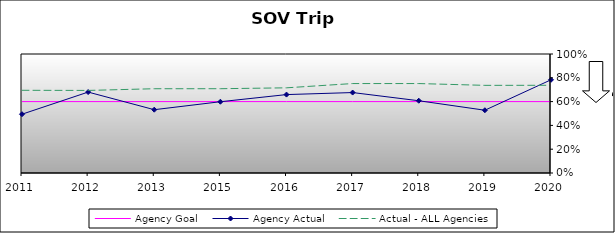
| Category | Agency Goal | Agency Actual | Actual - ALL Agencies |
|---|---|---|---|
| 2011.0 | 0.6 | 0.494 | 0.695 |
| 2012.0 | 0.6 | 0.68 | 0.694 |
| 2013.0 | 0.6 | 0.532 | 0.708 |
| 2015.0 | 0.6 | 0.599 | 0.708 |
| 2016.0 | 0.6 | 0.659 | 0.716 |
| 2017.0 | 0.6 | 0.676 | 0.752 |
| 2018.0 | 0.6 | 0.607 | 0.752 |
| 2019.0 | 0.6 | 0.528 | 0.736 |
| 2020.0 | 0.6 | 0.783 | 0.737 |